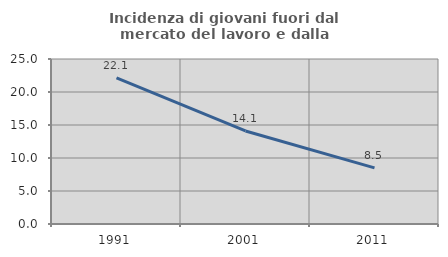
| Category | Incidenza di giovani fuori dal mercato del lavoro e dalla formazione  |
|---|---|
| 1991.0 | 22.131 |
| 2001.0 | 14.097 |
| 2011.0 | 8.511 |